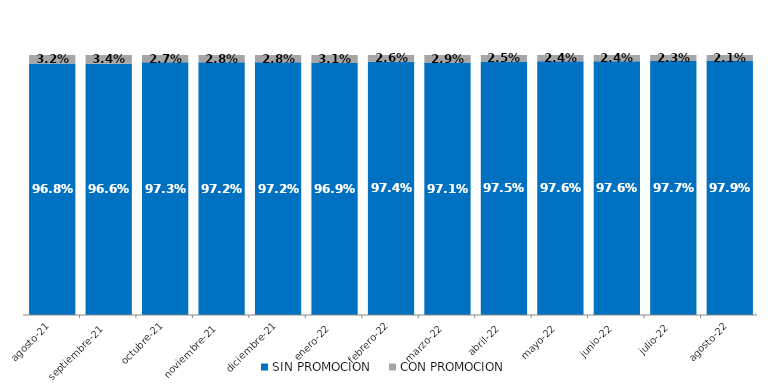
| Category | SIN PROMOCION   | CON PROMOCION   |
|---|---|---|
| 2021-08-01 | 0.968 | 0.032 |
| 2021-09-01 | 0.966 | 0.034 |
| 2021-10-01 | 0.973 | 0.027 |
| 2021-11-01 | 0.972 | 0.028 |
| 2021-12-01 | 0.972 | 0.028 |
| 2022-01-01 | 0.969 | 0.031 |
| 2022-02-01 | 0.974 | 0.026 |
| 2022-03-01 | 0.971 | 0.029 |
| 2022-04-01 | 0.975 | 0.025 |
| 2022-05-01 | 0.976 | 0.024 |
| 2022-06-01 | 0.976 | 0.024 |
| 2022-07-01 | 0.977 | 0.023 |
| 2022-08-01 | 0.979 | 0.021 |